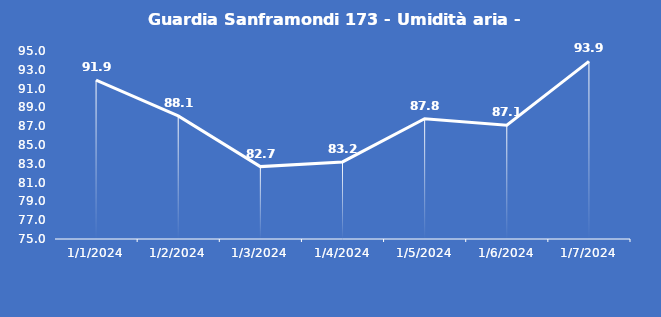
| Category | Guardia Sanframondi 173 - Umidità aria - Grezzo (%) |
|---|---|
| 1/1/24 | 91.9 |
| 1/2/24 | 88.1 |
| 1/3/24 | 82.7 |
| 1/4/24 | 83.2 |
| 1/5/24 | 87.8 |
| 1/6/24 | 87.1 |
| 1/7/24 | 93.9 |